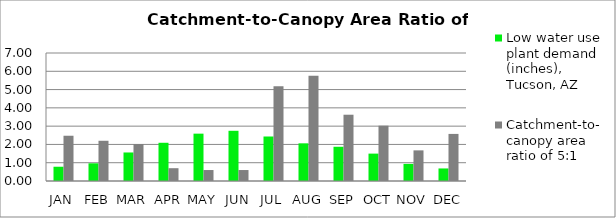
| Category | Low water use plant demand (inches), Tucson, AZ  | Catchment-to-canopy area ratio of 5:1  |
|---|---|---|
| JAN | 0.78 | 2.475 |
| FEB | 0.967 | 2.2 |
| MAR | 1.56 | 2.025 |
| APR | 2.09 | 0.7 |
| MAY | 2.59 | 0.6 |
| JUN | 2.746 | 0.6 |
| JUL | 2.434 | 5.175 |
| AUG | 2.059 | 5.75 |
| SEP | 1.872 | 3.625 |
| OCT | 1.498 | 3.025 |
| NOV | 0.936 | 1.675 |
| DEC | 0.686 | 2.575 |